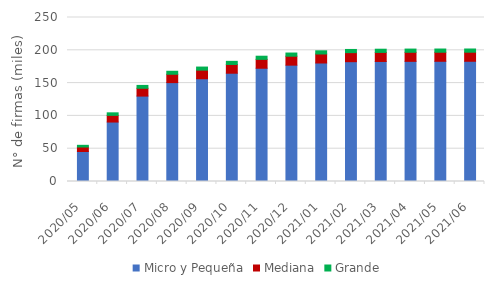
| Category | Micro y Pequeña | Mediana | Grande |
|---|---|---|---|
| 2020-05-01 | 45.705 | 6.862 | 2.584 |
| 2020-06-01 | 90.644 | 10.175 | 3.866 |
| 2020-07-01 | 130.197 | 11.929 | 4.354 |
| 2020-08-01 | 150.739 | 12.724 | 4.573 |
| 2020-09-01 | 156.661 | 13.101 | 4.691 |
| 2020-10-01 | 165.069 | 13.337 | 4.76 |
| 2020-11-01 | 172.647 | 13.54 | 4.808 |
| 2020-12-01 | 177.348 | 13.652 | 4.836 |
| 2021-01-01 | 180.644 | 13.734 | 4.851 |
| 2021-02-01 | 182.648 | 13.781 | 4.861 |
| 2021-03-01 | 182.977 | 13.801 | 4.876 |
| 2021-04-01 | 183.162 | 13.815 | 4.887 |
| 2021-05-01 | 183.244 | 13.813 | 4.887 |
| 2021-06-01 | 183.279 | 13.814 | 4.886 |